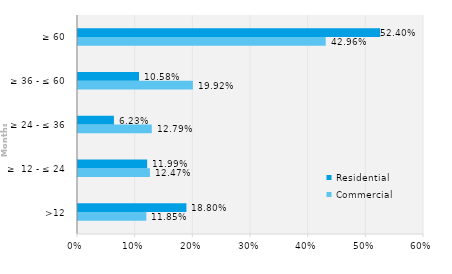
| Category | Commercial | Residential |
|---|---|---|
| >12 | 0.118 | 0.188 |
| ≥  12 - ≤ 24 | 0.125 | 0.12 |
| ≥ 24 - ≤ 36 | 0.128 | 0.062 |
| ≥ 36 - ≤ 60 | 0.199 | 0.106 |
| ≥ 60 | 0.43 | 0.524 |